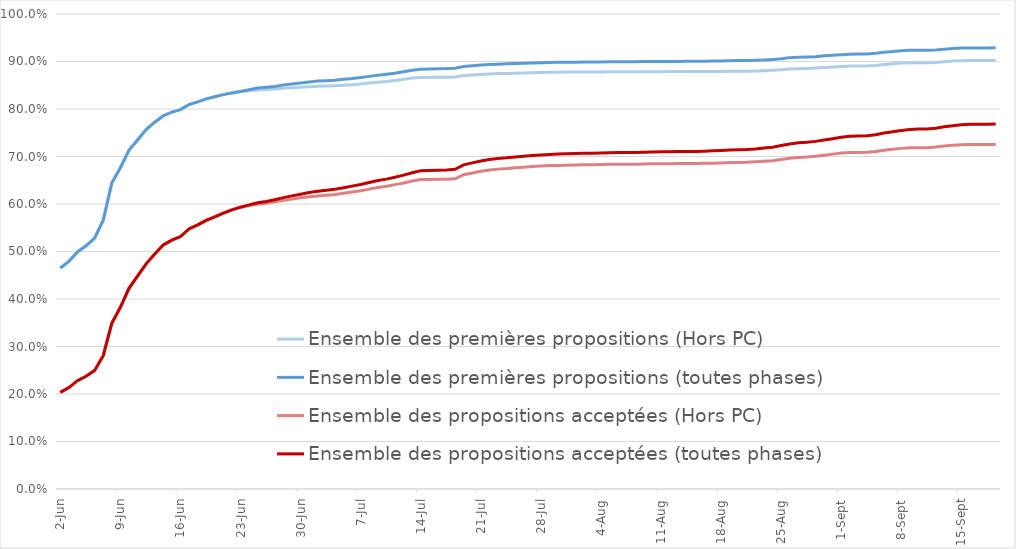
| Category | Ensemble des premières propositions (Hors PC) | Ensemble des premières propositions (toutes phases) | Ensemble des propositions acceptées (Hors PC) | Ensemble des propositions acceptées (toutes phases) |
|---|---|---|---|---|
| 2022-06-02 | 0.465 | 0.465 | 0.203 | 0.203 |
| 2022-06-03 | 0.479 | 0.479 | 0.214 | 0.214 |
| 2022-06-04 | 0.499 | 0.499 | 0.228 | 0.228 |
| 2022-06-05 | 0.512 | 0.512 | 0.237 | 0.237 |
| 2022-06-06 | 0.528 | 0.528 | 0.25 | 0.25 |
| 2022-06-07 | 0.566 | 0.566 | 0.281 | 0.281 |
| 2022-06-08 | 0.644 | 0.644 | 0.349 | 0.349 |
| 2022-06-09 | 0.676 | 0.676 | 0.383 | 0.383 |
| 2022-06-10 | 0.713 | 0.713 | 0.423 | 0.423 |
| 2022-06-11 | 0.735 | 0.735 | 0.448 | 0.448 |
| 2022-06-12 | 0.757 | 0.757 | 0.474 | 0.474 |
| 2022-06-13 | 0.772 | 0.772 | 0.495 | 0.495 |
| 2022-06-14 | 0.786 | 0.786 | 0.514 | 0.514 |
| 2022-06-15 | 0.793 | 0.793 | 0.524 | 0.524 |
| 2022-06-16 | 0.799 | 0.799 | 0.532 | 0.532 |
| 2022-06-17 | 0.809 | 0.809 | 0.548 | 0.548 |
| 2022-06-18 | 0.815 | 0.815 | 0.556 | 0.556 |
| 2022-06-19 | 0.821 | 0.821 | 0.566 | 0.566 |
| 2022-06-20 | 0.826 | 0.826 | 0.573 | 0.573 |
| 2022-06-21 | 0.83 | 0.83 | 0.581 | 0.581 |
| 2022-06-22 | 0.834 | 0.834 | 0.588 | 0.588 |
| 2022-06-23 | 0.837 | 0.837 | 0.593 | 0.593 |
| 2022-06-24 | 0.838 | 0.841 | 0.597 | 0.598 |
| 2022-06-25 | 0.84 | 0.844 | 0.6 | 0.603 |
| 2022-06-26 | 0.841 | 0.846 | 0.602 | 0.605 |
| 2022-06-27 | 0.842 | 0.848 | 0.605 | 0.609 |
| 2022-06-28 | 0.844 | 0.85 | 0.608 | 0.613 |
| 2022-06-29 | 0.845 | 0.853 | 0.61 | 0.617 |
| 2022-06-30 | 0.846 | 0.855 | 0.613 | 0.621 |
| 2022-07-01 | 0.847 | 0.857 | 0.615 | 0.624 |
| 2022-07-02 | 0.848 | 0.859 | 0.617 | 0.627 |
| 2022-07-03 | 0.848 | 0.86 | 0.618 | 0.629 |
| 2022-07-04 | 0.849 | 0.861 | 0.62 | 0.631 |
| 2022-07-05 | 0.85 | 0.863 | 0.622 | 0.634 |
| 2022-07-06 | 0.851 | 0.864 | 0.625 | 0.638 |
| 2022-07-07 | 0.853 | 0.866 | 0.628 | 0.641 |
| 2022-07-08 | 0.855 | 0.869 | 0.631 | 0.645 |
| 2022-07-09 | 0.856 | 0.871 | 0.635 | 0.649 |
| 2022-07-10 | 0.858 | 0.873 | 0.637 | 0.652 |
| 2022-07-11 | 0.86 | 0.875 | 0.641 | 0.656 |
| 2022-07-12 | 0.862 | 0.878 | 0.644 | 0.661 |
| 2022-07-13 | 0.865 | 0.882 | 0.648 | 0.666 |
| 2022-07-14 | 0.866 | 0.884 | 0.652 | 0.67 |
| 2022-07-15 | 0.867 | 0.884 | 0.652 | 0.671 |
| 2022-07-16 | 0.867 | 0.885 | 0.652 | 0.671 |
| 2022-07-17 | 0.867 | 0.885 | 0.652 | 0.672 |
| 2022-07-18 | 0.868 | 0.886 | 0.653 | 0.673 |
| 2022-07-19 | 0.87 | 0.889 | 0.662 | 0.682 |
| 2022-07-20 | 0.872 | 0.891 | 0.665 | 0.687 |
| 2022-07-21 | 0.873 | 0.892 | 0.669 | 0.691 |
| 2022-07-22 | 0.874 | 0.894 | 0.672 | 0.694 |
| 2022-07-23 | 0.874 | 0.894 | 0.673 | 0.696 |
| 2022-07-24 | 0.875 | 0.895 | 0.675 | 0.697 |
| 2022-07-25 | 0.875 | 0.896 | 0.676 | 0.699 |
| 2022-07-26 | 0.876 | 0.896 | 0.678 | 0.701 |
| 2022-07-27 | 0.876 | 0.897 | 0.679 | 0.702 |
| 2022-07-28 | 0.877 | 0.897 | 0.68 | 0.703 |
| 2022-07-29 | 0.877 | 0.898 | 0.681 | 0.704 |
| 2022-07-30 | 0.878 | 0.898 | 0.681 | 0.705 |
| 2022-07-31 | 0.878 | 0.898 | 0.682 | 0.706 |
| 2022-08-01 | 0.878 | 0.899 | 0.682 | 0.706 |
| 2022-08-02 | 0.878 | 0.899 | 0.683 | 0.707 |
| 2022-08-03 | 0.878 | 0.899 | 0.683 | 0.707 |
| 2022-08-04 | 0.878 | 0.899 | 0.683 | 0.707 |
| 2022-08-05 | 0.878 | 0.899 | 0.683 | 0.708 |
| 2022-08-06 | 0.878 | 0.899 | 0.684 | 0.708 |
| 2022-08-07 | 0.878 | 0.899 | 0.684 | 0.708 |
| 2022-08-08 | 0.878 | 0.9 | 0.684 | 0.709 |
| 2022-08-09 | 0.878 | 0.9 | 0.684 | 0.709 |
| 2022-08-10 | 0.879 | 0.9 | 0.685 | 0.709 |
| 2022-08-11 | 0.879 | 0.9 | 0.685 | 0.71 |
| 2022-08-12 | 0.879 | 0.9 | 0.685 | 0.71 |
| 2022-08-13 | 0.879 | 0.9 | 0.685 | 0.71 |
| 2022-08-14 | 0.879 | 0.9 | 0.685 | 0.71 |
| 2022-08-15 | 0.879 | 0.9 | 0.685 | 0.711 |
| 2022-08-16 | 0.879 | 0.901 | 0.686 | 0.711 |
| 2022-08-17 | 0.879 | 0.901 | 0.686 | 0.712 |
| 2022-08-18 | 0.879 | 0.901 | 0.687 | 0.713 |
| 2022-08-19 | 0.879 | 0.902 | 0.687 | 0.714 |
| 2022-08-20 | 0.88 | 0.902 | 0.688 | 0.714 |
| 2022-08-21 | 0.88 | 0.902 | 0.688 | 0.715 |
| 2022-08-22 | 0.88 | 0.902 | 0.689 | 0.716 |
| 2022-08-23 | 0.881 | 0.903 | 0.69 | 0.718 |
| 2022-08-24 | 0.881 | 0.904 | 0.691 | 0.719 |
| 2022-08-25 | 0.882 | 0.906 | 0.694 | 0.723 |
| 2022-08-26 | 0.884 | 0.908 | 0.696 | 0.727 |
| 2022-08-27 | 0.885 | 0.909 | 0.698 | 0.729 |
| 2022-08-28 | 0.885 | 0.909 | 0.699 | 0.73 |
| 2022-08-29 | 0.886 | 0.91 | 0.701 | 0.732 |
| 2022-08-30 | 0.888 | 0.912 | 0.703 | 0.735 |
| 2022-08-31 | 0.889 | 0.913 | 0.705 | 0.738 |
| 2022-09-01 | 0.89 | 0.914 | 0.707 | 0.74 |
| 2022-09-02 | 0.89 | 0.915 | 0.709 | 0.742 |
| 2022-09-03 | 0.89 | 0.916 | 0.709 | 0.743 |
| 2022-09-04 | 0.89 | 0.916 | 0.709 | 0.744 |
| 2022-09-05 | 0.892 | 0.917 | 0.711 | 0.746 |
| 2022-09-06 | 0.894 | 0.92 | 0.713 | 0.749 |
| 2022-09-07 | 0.895 | 0.921 | 0.715 | 0.752 |
| 2022-09-08 | 0.897 | 0.923 | 0.717 | 0.755 |
| 2022-09-09 | 0.897 | 0.924 | 0.718 | 0.757 |
| 2022-09-10 | 0.897 | 0.924 | 0.719 | 0.758 |
| 2022-09-11 | 0.897 | 0.924 | 0.719 | 0.758 |
| 2022-09-12 | 0.898 | 0.924 | 0.72 | 0.76 |
| 2022-09-13 | 0.9 | 0.926 | 0.722 | 0.763 |
| 2022-09-14 | 0.901 | 0.927 | 0.724 | 0.765 |
| 2022-09-15 | 0.902 | 0.928 | 0.724 | 0.767 |
| 2022-09-16 | 0.902 | 0.929 | 0.725 | 0.768 |
| 2022-09-17 | 0.902 | 0.929 | 0.725 | 0.768 |
| 2022-09-18 | 0.902 | 0.929 | 0.725 | 0.768 |
| 2022-09-19 | 0.902 | 0.929 | 0.725 | 0.768 |